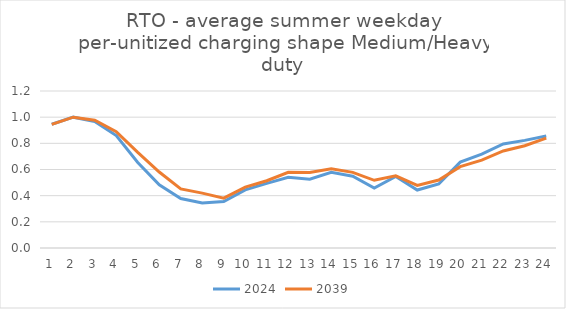
| Category | 2024 | 2039 |
|---|---|---|
| 0 | 0.946 | 0.945 |
| 1 | 1 | 1 |
| 2 | 0.968 | 0.976 |
| 3 | 0.859 | 0.889 |
| 4 | 0.653 | 0.731 |
| 5 | 0.483 | 0.581 |
| 6 | 0.378 | 0.452 |
| 7 | 0.345 | 0.419 |
| 8 | 0.355 | 0.381 |
| 9 | 0.444 | 0.465 |
| 10 | 0.494 | 0.514 |
| 11 | 0.541 | 0.579 |
| 12 | 0.525 | 0.577 |
| 13 | 0.578 | 0.605 |
| 14 | 0.549 | 0.578 |
| 15 | 0.458 | 0.517 |
| 16 | 0.546 | 0.551 |
| 17 | 0.443 | 0.478 |
| 18 | 0.489 | 0.519 |
| 19 | 0.656 | 0.622 |
| 20 | 0.717 | 0.672 |
| 21 | 0.796 | 0.742 |
| 22 | 0.823 | 0.782 |
| 23 | 0.857 | 0.84 |